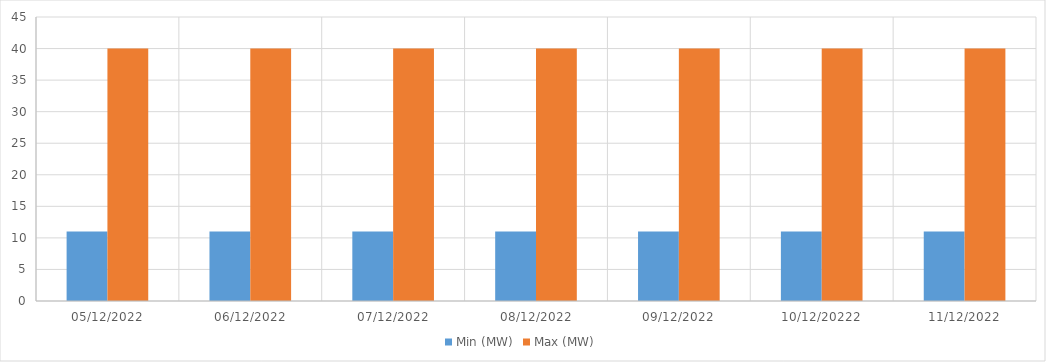
| Category | Min (MW) | Max (MW) |
|---|---|---|
| 05/12/2022 | 11 | 40 |
| 06/12/2022 | 11 | 40 |
| 07/12/2022 | 11 | 40 |
| 08/12/2022 | 11 | 40 |
| 09/12/2022 | 11 | 40 |
| 10/12/20222 | 11 | 40 |
| 11/12/2022 | 11 | 40 |